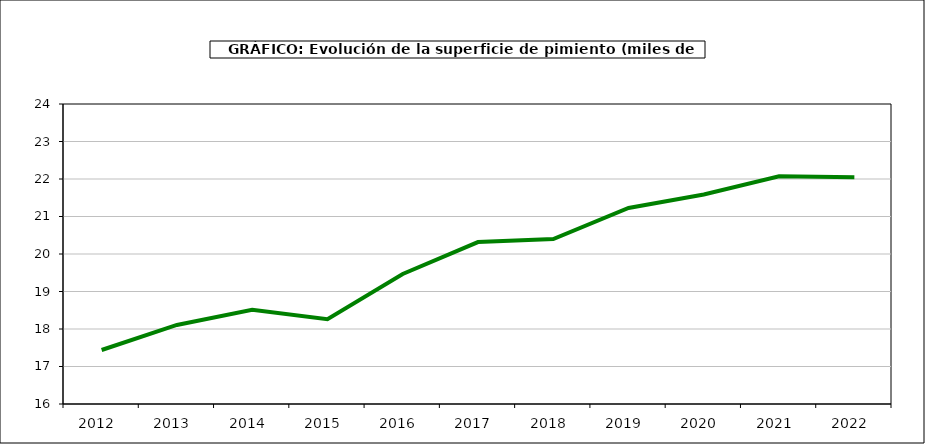
| Category | superficie |
|---|---|
| 2012.0 | 17.44 |
| 2013.0 | 18.108 |
| 2014.0 | 18.513 |
| 2015.0 | 18.263 |
| 2016.0 | 19.468 |
| 2017.0 | 20.319 |
| 2018.0 | 20.399 |
| 2019.0 | 21.229 |
| 2020.0 | 21.587 |
| 2021.0 | 22.07 |
| 2022.0 | 22.048 |